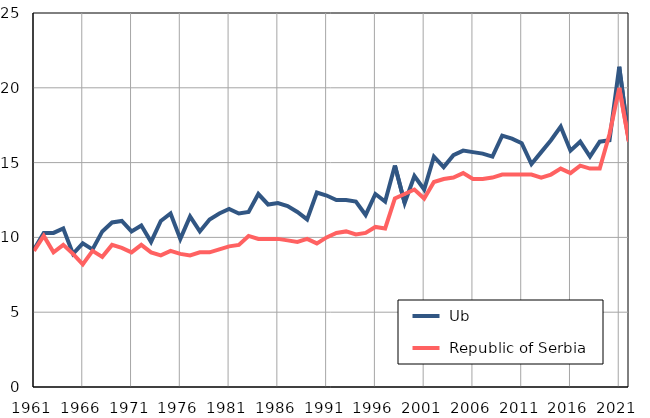
| Category |  Ub |  Republic of Serbia |
|---|---|---|
| 1961.0 | 9.2 | 9.1 |
| 1962.0 | 10.3 | 10.1 |
| 1963.0 | 10.3 | 9 |
| 1964.0 | 10.6 | 9.5 |
| 1965.0 | 8.9 | 8.9 |
| 1966.0 | 9.6 | 8.2 |
| 1967.0 | 9.2 | 9.1 |
| 1968.0 | 10.4 | 8.7 |
| 1969.0 | 11 | 9.5 |
| 1970.0 | 11.1 | 9.3 |
| 1971.0 | 10.4 | 9 |
| 1972.0 | 10.8 | 9.5 |
| 1973.0 | 9.7 | 9 |
| 1974.0 | 11.1 | 8.8 |
| 1975.0 | 11.6 | 9.1 |
| 1976.0 | 9.9 | 8.9 |
| 1977.0 | 11.4 | 8.8 |
| 1978.0 | 10.4 | 9 |
| 1979.0 | 11.2 | 9 |
| 1980.0 | 11.6 | 9.2 |
| 1981.0 | 11.9 | 9.4 |
| 1982.0 | 11.6 | 9.5 |
| 1983.0 | 11.7 | 10.1 |
| 1984.0 | 12.9 | 9.9 |
| 1985.0 | 12.2 | 9.9 |
| 1986.0 | 12.3 | 9.9 |
| 1987.0 | 12.1 | 9.8 |
| 1988.0 | 11.7 | 9.7 |
| 1989.0 | 11.2 | 9.9 |
| 1990.0 | 13 | 9.6 |
| 1991.0 | 12.8 | 10 |
| 1992.0 | 12.5 | 10.3 |
| 1993.0 | 12.5 | 10.4 |
| 1994.0 | 12.4 | 10.2 |
| 1995.0 | 11.5 | 10.3 |
| 1996.0 | 12.9 | 10.7 |
| 1997.0 | 12.4 | 10.6 |
| 1998.0 | 14.8 | 12.6 |
| 1999.0 | 12.3 | 12.9 |
| 2000.0 | 14.1 | 13.2 |
| 2001.0 | 13.2 | 12.6 |
| 2002.0 | 15.4 | 13.7 |
| 2003.0 | 14.7 | 13.9 |
| 2004.0 | 15.5 | 14 |
| 2005.0 | 15.8 | 14.3 |
| 2006.0 | 15.7 | 13.9 |
| 2007.0 | 15.6 | 13.9 |
| 2008.0 | 15.4 | 14 |
| 2009.0 | 16.8 | 14.2 |
| 2010.0 | 16.6 | 14.2 |
| 2011.0 | 16.3 | 14.2 |
| 2012.0 | 14.9 | 14.2 |
| 2013.0 | 15.7 | 14 |
| 2014.0 | 16.5 | 14.2 |
| 2015.0 | 17.4 | 14.6 |
| 2016.0 | 15.8 | 14.3 |
| 2017.0 | 16.4 | 14.8 |
| 2018.0 | 15.4 | 14.6 |
| 2019.0 | 16.4 | 14.6 |
| 2020.0 | 16.5 | 16.9 |
| 2021.0 | 21.4 | 20 |
| 2022.0 | 16.4 | 16.4 |